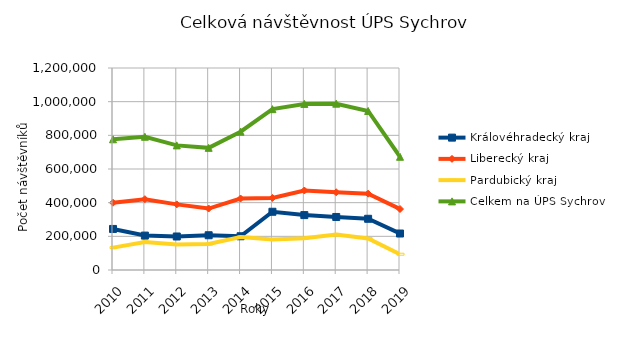
| Category | Královéhradecký kraj | Liberecký kraj | Pardubický kraj | Celkem na ÚPS Sychrov |
|---|---|---|---|---|
| 2010.0 | 243910 | 399672 | 133004 | 776586 |
| 2011.0 | 204481 | 420780 | 166238 | 791499 |
| 2012.0 | 199025 | 389781 | 151509 | 740315 |
| 2013.0 | 206419 | 365108 | 154165 | 725692 |
| 2014.0 | 200438 | 424718 | 196473 | 821629 |
| 2015.0 | 345970 | 428023 | 181567 | 955560 |
| 2016.0 | 326137 | 472318 | 188108 | 986563 |
| 2017.0 | 314983 | 461803 | 211268 | 988054 |
| 2018.0 | 304267 | 453568 | 187017 | 944852 |
| 2019.0 | 216711 | 362230 | 93729 | 672670 |